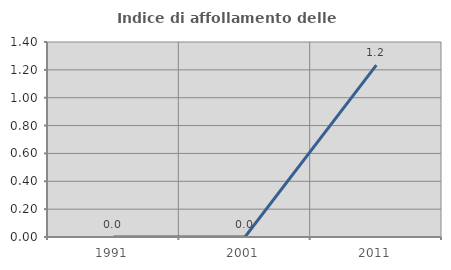
| Category | Indice di affollamento delle abitazioni  |
|---|---|
| 1991.0 | 0 |
| 2001.0 | 0 |
| 2011.0 | 1.235 |